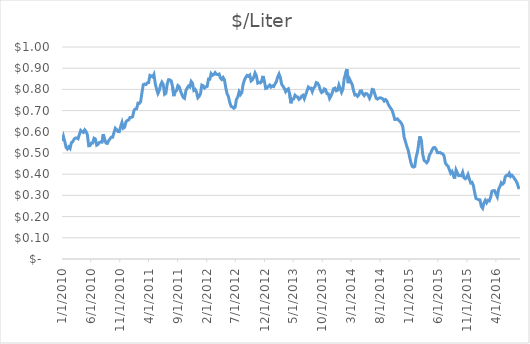
| Category | $/Liter |
|---|---|
| 8/5/16 | 0.335 |
| 7/29/16 | 0.336 |
| 7/22/16 | 0.357 |
| 7/15/16 | 0.37 |
| 7/8/16 | 0.378 |
| 7/1/16 | 0.388 |
| 6/24/16 | 0.395 |
| 6/17/16 | 0.389 |
| 6/10/16 | 0.404 |
| 6/3/16 | 0.394 |
| 5/27/16 | 0.395 |
| 5/20/16 | 0.388 |
| 5/13/16 | 0.36 |
| 5/6/16 | 0.353 |
| 4/29/16 | 0.36 |
| 4/22/16 | 0.342 |
| 4/15/16 | 0.329 |
| 4/8/16 | 0.293 |
| 4/1/16 | 0.307 |
| 3/25/16 | 0.322 |
| 3/18/16 | 0.323 |
| 3/11/16 | 0.32 |
| 3/4/16 | 0.291 |
| 2/26/16 | 0.274 |
| 2/19/16 | 0.277 |
| 2/12/16 | 0.265 |
| 2/5/16 | 0.277 |
| 1/29/16 | 0.265 |
| 1/22/16 | 0.24 |
| 1/15/16 | 0.248 |
| 1/8/16 | 0.279 |
| 1/1/16 | 0.279 |
| 12/25/15 | 0.283 |
| 12/18/15 | 0.285 |
| 12/11/15 | 0.315 |
| 12/4/15 | 0.347 |
| 11/27/15 | 0.362 |
| 11/20/15 | 0.359 |
| 11/13/15 | 0.377 |
| 11/6/15 | 0.398 |
| 10/30/15 | 0.384 |
| 10/23/15 | 0.378 |
| 10/16/15 | 0.383 |
| 10/9/15 | 0.409 |
| 10/2/15 | 0.393 |
| 9/25/15 | 0.394 |
| 9/18/15 | 0.393 |
| 9/11/15 | 0.406 |
| 9/4/15 | 0.42 |
| 8/28/15 | 0.379 |
| 8/21/15 | 0.397 |
| 8/14/15 | 0.413 |
| 8/7/15 | 0.405 |
| 7/31/15 | 0.421 |
| 7/24/15 | 0.438 |
| 7/17/15 | 0.444 |
| 7/10/15 | 0.453 |
| 7/3/15 | 0.487 |
| 6/26/15 | 0.496 |
| 6/19/15 | 0.498 |
| 6/12/15 | 0.502 |
| 6/5/15 | 0.501 |
| 5/29/15 | 0.502 |
| 5/22/15 | 0.519 |
| 5/15/15 | 0.526 |
| 5/8/15 | 0.525 |
| 5/1/15 | 0.515 |
| 4/24/15 | 0.5 |
| 4/17/15 | 0.49 |
| 4/10/15 | 0.463 |
| 4/3/15 | 0.454 |
| 3/27/15 | 0.461 |
| 3/20/15 | 0.465 |
| 3/13/15 | 0.493 |
| 3/6/15 | 0.557 |
| 2/27/15 | 0.579 |
| 2/20/15 | 0.544 |
| 2/13/15 | 0.504 |
| 2/6/15 | 0.48 |
| 1/30/15 | 0.437 |
| 1/23/15 | 0.434 |
| 1/16/15 | 0.437 |
| 1/9/15 | 0.457 |
| 1/2/15 | 0.485 |
| 12/26/14 | 0.515 |
| 12/19/14 | 0.532 |
| 12/12/14 | 0.553 |
| 12/5/14 | 0.575 |
| 11/28/14 | 0.624 |
| 11/21/14 | 0.639 |
| 11/14/14 | 0.648 |
| 11/7/14 | 0.653 |
| 10/31/14 | 0.661 |
| 10/24/14 | 0.659 |
| 10/17/14 | 0.658 |
| 10/10/14 | 0.681 |
| 10/3/14 | 0.701 |
| 9/26/14 | 0.71 |
| 9/19/14 | 0.72 |
| 9/12/14 | 0.731 |
| 9/5/14 | 0.746 |
| 8/29/14 | 0.752 |
| 8/22/14 | 0.745 |
| 8/15/14 | 0.755 |
| 8/8/14 | 0.759 |
| 8/1/14 | 0.761 |
| 7/25/14 | 0.759 |
| 7/18/14 | 0.754 |
| 7/11/14 | 0.758 |
| 7/4/14 | 0.778 |
| 6/27/14 | 0.798 |
| 6/20/14 | 0.8 |
| 6/13/14 | 0.773 |
| 6/6/14 | 0.758 |
| 5/30/14 | 0.772 |
| 5/23/14 | 0.78 |
| 5/16/14 | 0.78 |
| 5/9/14 | 0.771 |
| 5/2/14 | 0.778 |
| 4/25/14 | 0.793 |
| 4/18/14 | 0.793 |
| 4/11/14 | 0.775 |
| 4/4/14 | 0.767 |
| 3/28/14 | 0.775 |
| 3/21/14 | 0.773 |
| 3/14/14 | 0.794 |
| 3/7/14 | 0.823 |
| 2/28/14 | 0.836 |
| 2/21/14 | 0.849 |
| 2/14/14 | 0.83 |
| 2/7/14 | 0.895 |
| 1/31/14 | 0.873 |
| 1/24/14 | 0.852 |
| 1/17/14 | 0.801 |
| 1/10/14 | 0.786 |
| 1/3/14 | 0.803 |
| 12/27/13 | 0.821 |
| 12/20/13 | 0.796 |
| 12/13/13 | 0.793 |
| 12/6/13 | 0.806 |
| 11/29/13 | 0.804 |
| 11/22/13 | 0.784 |
| 11/15/13 | 0.768 |
| 11/8/13 | 0.757 |
| 11/1/13 | 0.779 |
| 10/25/13 | 0.78 |
| 10/18/13 | 0.799 |
| 10/11/13 | 0.803 |
| 10/4/13 | 0.789 |
| 9/27/13 | 0.785 |
| 9/20/13 | 0.797 |
| 9/13/13 | 0.819 |
| 9/6/13 | 0.83 |
| 8/30/13 | 0.832 |
| 8/23/13 | 0.813 |
| 8/16/13 | 0.807 |
| 8/9/13 | 0.789 |
| 8/2/13 | 0.806 |
| 7/26/13 | 0.805 |
| 7/19/13 | 0.811 |
| 7/12/13 | 0.792 |
| 7/5/13 | 0.775 |
| 6/28/13 | 0.757 |
| 6/21/13 | 0.772 |
| 6/14/13 | 0.768 |
| 6/7/13 | 0.758 |
| 5/31/13 | 0.753 |
| 5/24/13 | 0.764 |
| 5/17/13 | 0.766 |
| 5/10/13 | 0.772 |
| 5/3/13 | 0.755 |
| 4/26/13 | 0.754 |
| 4/19/13 | 0.734 |
| 4/12/13 | 0.777 |
| 4/5/13 | 0.803 |
| 3/29/13 | 0.799 |
| 3/22/13 | 0.789 |
| 3/15/13 | 0.804 |
| 3/8/13 | 0.815 |
| 3/1/13 | 0.824 |
| 2/22/13 | 0.856 |
| 2/15/13 | 0.873 |
| 2/8/13 | 0.859 |
| 2/1/13 | 0.837 |
| 1/25/13 | 0.826 |
| 1/18/13 | 0.814 |
| 1/11/13 | 0.817 |
| 1/4/13 | 0.811 |
| 12/28/12 | 0.821 |
| 12/21/12 | 0.814 |
| 12/14/12 | 0.807 |
| 12/7/12 | 0.804 |
| 11/30/12 | 0.839 |
| 11/23/12 | 0.863 |
| 11/16/12 | 0.838 |
| 11/9/12 | 0.831 |
| 11/2/12 | 0.833 |
| 10/26/12 | 0.83 |
| 10/19/12 | 0.865 |
| 10/12/12 | 0.878 |
| 10/5/12 | 0.857 |
| 9/28/12 | 0.845 |
| 9/21/12 | 0.84 |
| 9/14/12 | 0.868 |
| 9/7/12 | 0.862 |
| 8/31/12 | 0.866 |
| 8/24/12 | 0.857 |
| 8/17/12 | 0.844 |
| 8/10/12 | 0.823 |
| 8/3/12 | 0.784 |
| 7/27/12 | 0.775 |
| 7/20/12 | 0.788 |
| 7/13/12 | 0.765 |
| 7/6/12 | 0.753 |
| 6/29/12 | 0.716 |
| 6/22/12 | 0.711 |
| 6/15/12 | 0.717 |
| 6/8/12 | 0.72 |
| 6/1/12 | 0.738 |
| 5/25/12 | 0.766 |
| 5/18/12 | 0.779 |
| 5/11/12 | 0.807 |
| 5/4/12 | 0.845 |
| 4/27/12 | 0.856 |
| 4/20/12 | 0.847 |
| 4/13/12 | 0.854 |
| 4/6/12 | 0.873 |
| 3/30/12 | 0.87 |
| 3/23/12 | 0.871 |
| 3/16/12 | 0.879 |
| 3/9/12 | 0.87 |
| 3/2/12 | 0.867 |
| 2/24/12 | 0.874 |
| 2/17/12 | 0.848 |
| 2/10/12 | 0.849 |
| 2/3/12 | 0.814 |
| 1/27/12 | 0.812 |
| 1/20/12 | 0.807 |
| 1/13/12 | 0.817 |
| 1/6/12 | 0.82 |
| 12/30/11 | 0.78 |
| 12/23/11 | 0.767 |
| 12/16/11 | 0.761 |
| 12/9/11 | 0.788 |
| 12/2/11 | 0.8 |
| 11/25/11 | 0.795 |
| 11/18/11 | 0.829 |
| 11/11/11 | 0.837 |
| 11/4/11 | 0.812 |
| 10/28/11 | 0.816 |
| 10/21/11 | 0.807 |
| 10/14/11 | 0.794 |
| 10/7/11 | 0.758 |
| 9/30/11 | 0.762 |
| 9/23/11 | 0.776 |
| 9/16/11 | 0.792 |
| 9/9/11 | 0.813 |
| 9/2/11 | 0.818 |
| 8/26/11 | 0.795 |
| 8/19/11 | 0.789 |
| 8/12/11 | 0.768 |
| 8/5/11 | 0.813 |
| 7/29/11 | 0.84 |
| 7/22/11 | 0.845 |
| 7/15/11 | 0.846 |
| 7/8/11 | 0.826 |
| 7/1/11 | 0.782 |
| 6/24/11 | 0.777 |
| 6/17/11 | 0.823 |
| 6/10/11 | 0.835 |
| 6/3/11 | 0.821 |
| 5/27/11 | 0.794 |
| 5/20/11 | 0.781 |
| 5/13/11 | 0.801 |
| 5/6/11 | 0.827 |
| 4/29/11 | 0.871 |
| 4/22/11 | 0.859 |
| 4/15/11 | 0.863 |
| 4/8/11 | 0.866 |
| 4/1/11 | 0.832 |
| 3/25/11 | 0.831 |
| 3/18/11 | 0.823 |
| 3/11/11 | 0.825 |
| 3/4/11 | 0.822 |
| 2/25/11 | 0.784 |
| 2/18/11 | 0.742 |
| 2/11/11 | 0.734 |
| 2/4/11 | 0.735 |
| 1/28/11 | 0.708 |
| 1/21/11 | 0.708 |
| 1/14/11 | 0.7 |
| 1/7/11 | 0.671 |
| 12/31/10 | 0.668 |
| 12/24/10 | 0.668 |
| 12/17/10 | 0.656 |
| 12/10/10 | 0.654 |
| 12/3/10 | 0.647 |
| 11/26/10 | 0.622 |
| 11/19/10 | 0.617 |
| 11/12/10 | 0.644 |
| 11/5/10 | 0.625 |
| 10/29/10 | 0.601 |
| 10/22/10 | 0.601 |
| 10/15/10 | 0.61 |
| 10/8/10 | 0.617 |
| 10/1/10 | 0.597 |
| 9/24/10 | 0.575 |
| 9/17/10 | 0.575 |
| 9/10/10 | 0.567 |
| 9/3/10 | 0.558 |
| 8/27/10 | 0.545 |
| 8/20/10 | 0.547 |
| 8/13/10 | 0.566 |
| 8/6/10 | 0.589 |
| 7/30/10 | 0.551 |
| 7/23/10 | 0.552 |
| 7/16/10 | 0.55 |
| 7/9/10 | 0.541 |
| 7/2/10 | 0.537 |
| 6/25/10 | 0.566 |
| 6/18/10 | 0.57 |
| 6/11/10 | 0.547 |
| 6/4/10 | 0.547 |
| 5/28/10 | 0.535 |
| 5/21/10 | 0.534 |
| 5/14/10 | 0.586 |
| 5/7/10 | 0.602 |
| 4/30/10 | 0.609 |
| 4/23/10 | 0.597 |
| 4/16/10 | 0.6 |
| 4/9/10 | 0.607 |
| 4/2/10 | 0.588 |
| 3/26/10 | 0.567 |
| 3/19/10 | 0.571 |
| 3/12/10 | 0.571 |
| 3/5/10 | 0.565 |
| 2/26/10 | 0.553 |
| 2/19/10 | 0.549 |
| 2/12/10 | 0.521 |
| 2/5/10 | 0.529 |
| 1/29/10 | 0.519 |
| 1/22/10 | 0.527 |
| 1/15/10 | 0.554 |
| 1/8/10 | 0.579 |
| 1/1/10 | 0.557 |